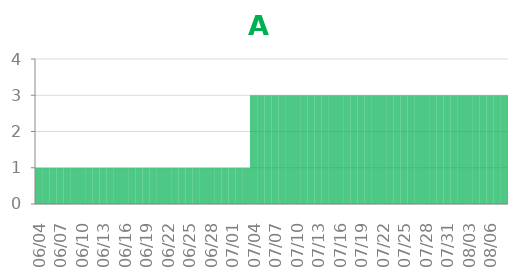
| Category | A |
|---|---|
| 2014-06-04 | 1 |
| 2014-06-05 | 1 |
| 2014-06-06 | 1 |
| 2014-06-07 | 1 |
| 2014-06-08 | 1 |
| 2014-06-09 | 1 |
| 2014-06-10 | 1 |
| 2014-06-11 | 1 |
| 2014-06-12 | 1 |
| 2014-06-13 | 1 |
| 2014-06-14 | 1 |
| 2014-06-15 | 1 |
| 2014-06-16 | 1 |
| 2014-06-17 | 1 |
| 2014-06-18 | 1 |
| 2014-06-19 | 1 |
| 2014-06-20 | 1 |
| 2014-06-21 | 1 |
| 2014-06-22 | 1 |
| 2014-06-23 | 1 |
| 2014-06-24 | 1 |
| 2014-06-25 | 1 |
| 2014-06-26 | 1 |
| 2014-06-27 | 1 |
| 2014-06-28 | 1 |
| 2014-06-29 | 1 |
| 2014-06-30 | 1 |
| 2014-07-01 | 1 |
| 2014-07-02 | 1 |
| 2014-07-03 | 1 |
| 2014-07-04 | 3 |
| 2014-07-05 | 3 |
| 2014-07-06 | 3 |
| 2014-07-07 | 3 |
| 2014-07-08 | 3 |
| 2014-07-09 | 3 |
| 2014-07-10 | 3 |
| 2014-07-11 | 3 |
| 2014-07-12 | 3 |
| 2014-07-13 | 3 |
| 2014-07-14 | 3 |
| 2014-07-15 | 3 |
| 2014-07-16 | 3 |
| 2014-07-17 | 3 |
| 2014-07-18 | 3 |
| 2014-07-19 | 3 |
| 2014-07-20 | 3 |
| 2014-07-21 | 3 |
| 2014-07-22 | 3 |
| 2014-07-23 | 3 |
| 2014-07-24 | 3 |
| 2014-07-25 | 3 |
| 2014-07-26 | 3 |
| 2014-07-27 | 3 |
| 2014-07-28 | 3 |
| 2014-07-29 | 3 |
| 2014-07-30 | 3 |
| 2014-07-31 | 3 |
| 2014-08-01 | 3 |
| 2014-08-02 | 3 |
| 2014-08-03 | 3 |
| 2014-08-04 | 3 |
| 2014-08-05 | 3 |
| 2014-08-06 | 3 |
| 2014-08-07 | 3 |
| 2014-08-08 | 3 |